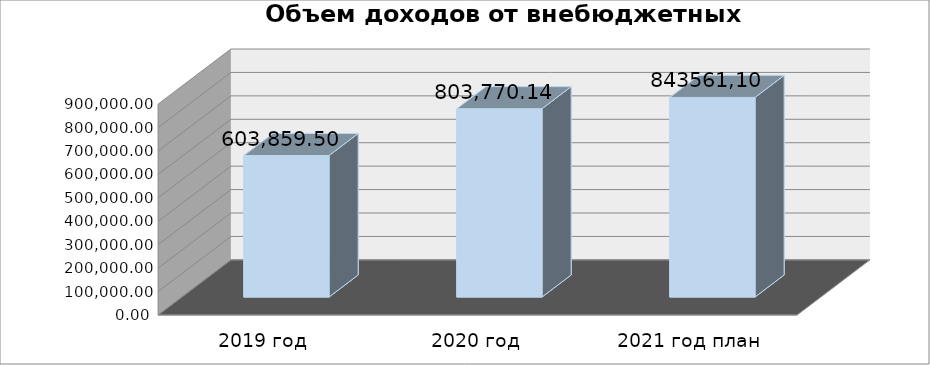
| Category | Series 0 |
|---|---|
| 2019 год | 603859.5 |
| 2020 год | 803770.14 |
| 2021 год план | 851905.8 |